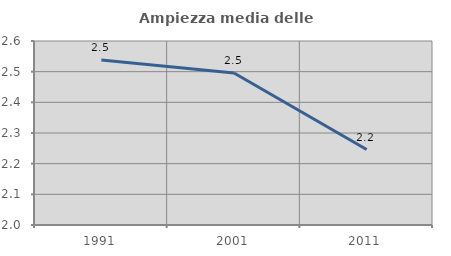
| Category | Ampiezza media delle famiglie |
|---|---|
| 1991.0 | 2.538 |
| 2001.0 | 2.496 |
| 2011.0 | 2.246 |